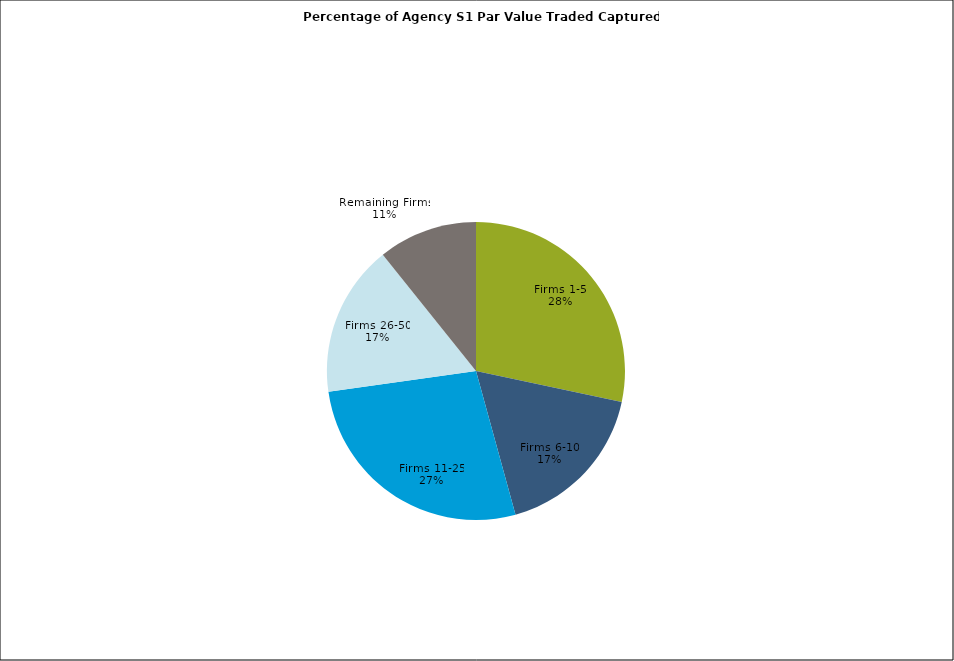
| Category | Series 0 |
|---|---|
| Firms 1-5 | 0.283 |
| Firms 6-10 | 0.174 |
| Firms 11-25 | 0.271 |
| Firms 26-50 | 0.165 |
| Remaining Firms | 0.108 |